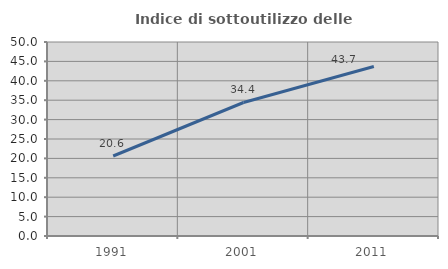
| Category | Indice di sottoutilizzo delle abitazioni  |
|---|---|
| 1991.0 | 20.617 |
| 2001.0 | 34.409 |
| 2011.0 | 43.675 |